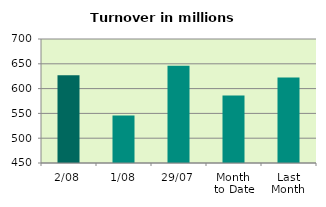
| Category | Series 0 |
|---|---|
| 2/08 | 626.946 |
| 1/08 | 545.619 |
| 29/07 | 646.192 |
| Month 
to Date | 586.283 |
| Last
Month | 622.259 |